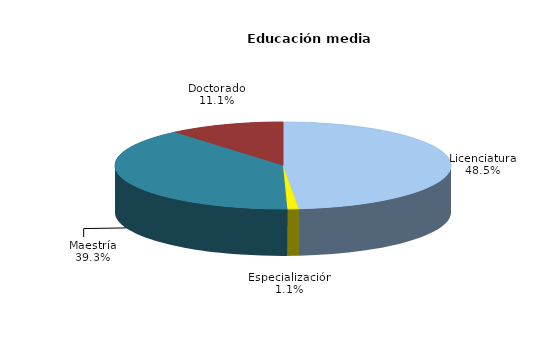
| Category | Series 0 |
|---|---|
| Licenciatura | 590 |
| Especialización | 13 |
| Maestría | 478 |
| Doctorado | 135 |